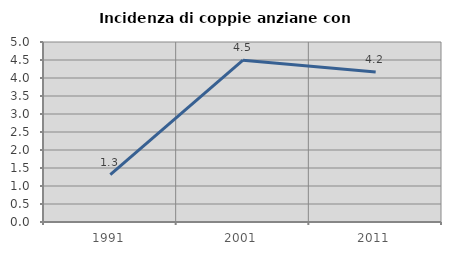
| Category | Incidenza di coppie anziane con figli |
|---|---|
| 1991.0 | 1.316 |
| 2001.0 | 4.494 |
| 2011.0 | 4.167 |